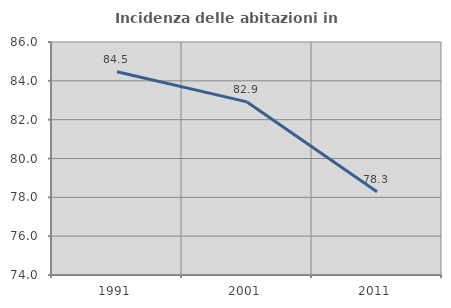
| Category | Incidenza delle abitazioni in proprietà  |
|---|---|
| 1991.0 | 84.464 |
| 2001.0 | 82.915 |
| 2011.0 | 78.283 |